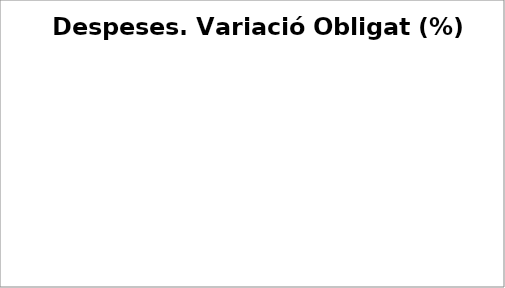
| Category | Series 0 |
|---|---|
| Despeses de personal | 0.02 |
| Despeses en béns corrents i serveis | -0.038 |
| Despeses financeres | -0.503 |
| Transferències corrents | 0.054 |
| Fons de contingència | 0 |
| Inversions reals | -0.03 |
| Transferències de capital | 1.742 |
| Actius financers | 0.123 |
| Passius financers | -0.653 |